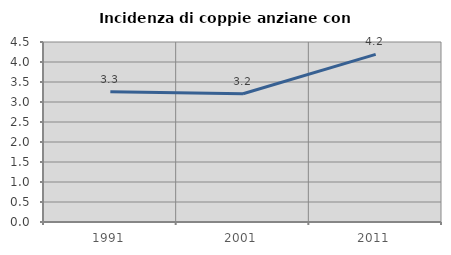
| Category | Incidenza di coppie anziane con figli |
|---|---|
| 1991.0 | 3.259 |
| 2001.0 | 3.206 |
| 2011.0 | 4.191 |